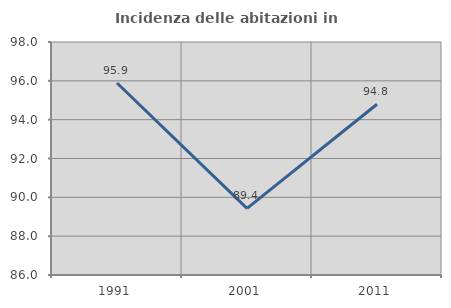
| Category | Incidenza delle abitazioni in proprietà  |
|---|---|
| 1991.0 | 95.89 |
| 2001.0 | 89.431 |
| 2011.0 | 94.792 |